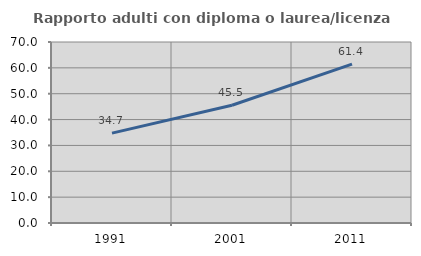
| Category | Rapporto adulti con diploma o laurea/licenza media  |
|---|---|
| 1991.0 | 34.746 |
| 2001.0 | 45.522 |
| 2011.0 | 61.417 |